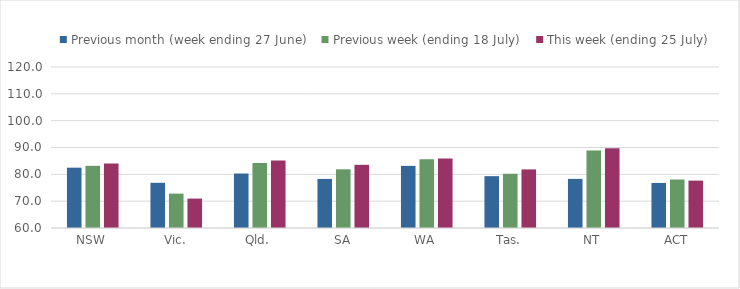
| Category | Previous month (week ending 27 June) | Previous week (ending 18 July) | This week (ending 25 July) |
|---|---|---|---|
| NSW | 82.479 | 83.169 | 84.08 |
| Vic. | 76.846 | 72.819 | 70.969 |
| Qld. | 80.295 | 84.209 | 85.193 |
| SA | 78.289 | 81.872 | 83.543 |
| WA | 83.152 | 85.61 | 85.931 |
| Tas. | 79.315 | 80.2 | 81.838 |
| NT | 78.298 | 88.842 | 89.766 |
| ACT | 76.784 | 78.068 | 77.665 |